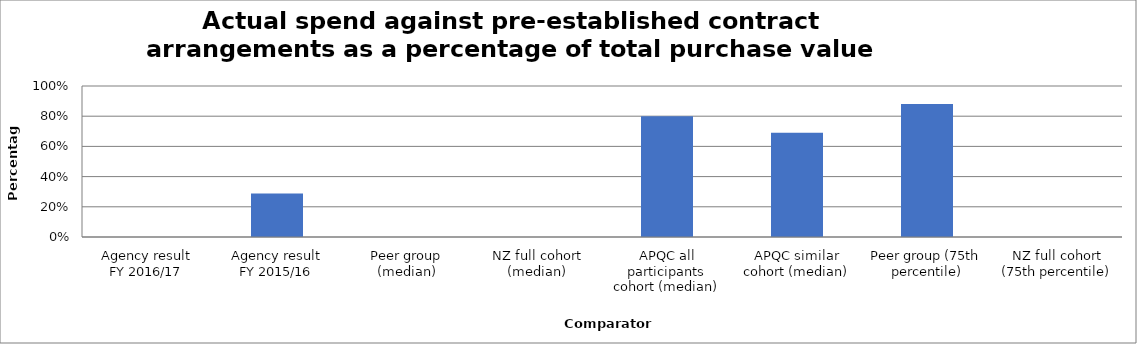
| Category | Result |
|---|---|
| Agency result
FY 2016/17 | 0 |
| Agency result
FY 2015/16 | 0.288 |
| Peer group (median) | 0 |
| NZ full cohort (median) | 0 |
| APQC all participants cohort (median) | 0.8 |
| APQC similar cohort (median) | 0.69 |
| Peer group (75th percentile) | 0.881 |
| NZ full cohort (75th percentile) | 0 |